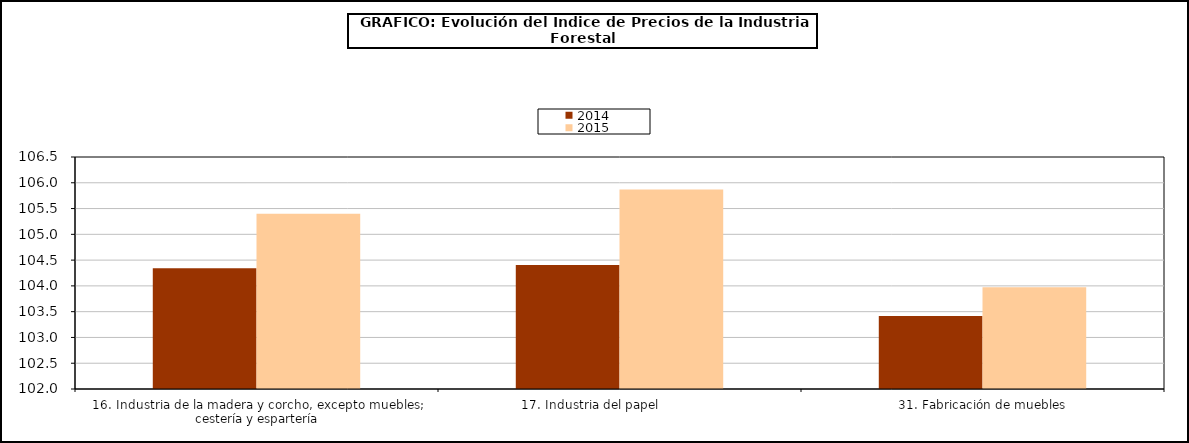
| Category | 2014 | 2015 |
|---|---|---|
| 16. Industria de la madera y corcho, excepto muebles; cestería y espartería | 104.344 | 105.4 |
| 17. Industria del papel                | 104.405 | 105.87 |
| 31. Fabricación de muebles | 103.415 | 103.972 |